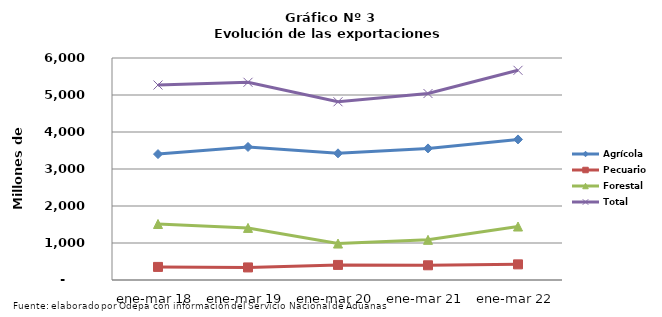
| Category | Agrícola | Pecuario | Forestal | Total |
|---|---|---|---|---|
| ene-mar 18 | 3402459 | 353570 | 1513784 | 5269813 |
| ene-mar 19 | 3595484 | 339813 | 1408089 | 5343386 |
| ene-mar 20 | 3423952 | 407918 | 985188 | 4817058 |
| ene-mar 21 | 3556262 | 397477 | 1085644 | 5039383 |
| ene-mar 22 | 3799154 | 422576 | 1445262 | 5666992 |